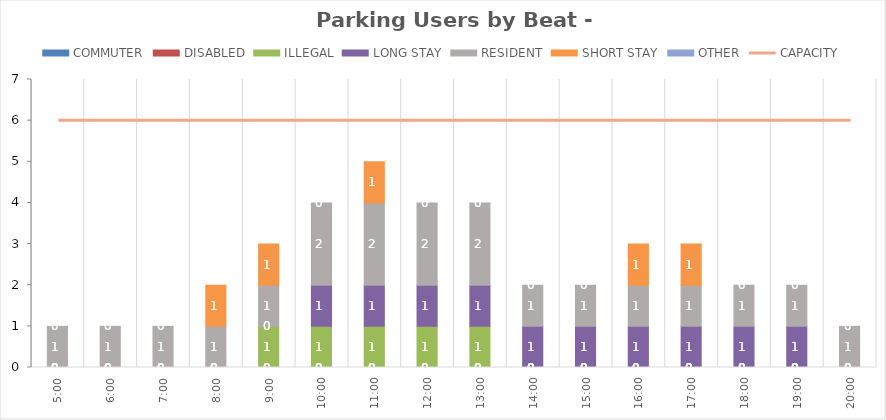
| Category | COMMUTER | DISABLED | ILLEGAL | LONG STAY | RESIDENT | SHORT STAY | OTHER |
|---|---|---|---|---|---|---|---|
| 0.20833333333333334 | 0 | 0 | 0 | 0 | 1 | 0 | 0 |
| 0.25 | 0 | 0 | 0 | 0 | 1 | 0 | 0 |
| 0.2916666666666667 | 0 | 0 | 0 | 0 | 1 | 0 | 0 |
| 0.3333333333333333 | 0 | 0 | 0 | 0 | 1 | 1 | 0 |
| 0.375 | 0 | 0 | 1 | 0 | 1 | 1 | 0 |
| 0.4166666666666667 | 0 | 0 | 1 | 1 | 2 | 0 | 0 |
| 0.4583333333333333 | 0 | 0 | 1 | 1 | 2 | 1 | 0 |
| 0.5 | 0 | 0 | 1 | 1 | 2 | 0 | 0 |
| 0.5416666666666666 | 0 | 0 | 1 | 1 | 2 | 0 | 0 |
| 0.5833333333333334 | 0 | 0 | 0 | 1 | 1 | 0 | 0 |
| 0.625 | 0 | 0 | 0 | 1 | 1 | 0 | 0 |
| 0.6666666666666666 | 0 | 0 | 0 | 1 | 1 | 1 | 0 |
| 0.7083333333333334 | 0 | 0 | 0 | 1 | 1 | 1 | 0 |
| 0.75 | 0 | 0 | 0 | 1 | 1 | 0 | 0 |
| 0.7916666666666666 | 0 | 0 | 0 | 1 | 1 | 0 | 0 |
| 0.8333333333333334 | 0 | 0 | 0 | 0 | 1 | 0 | 0 |